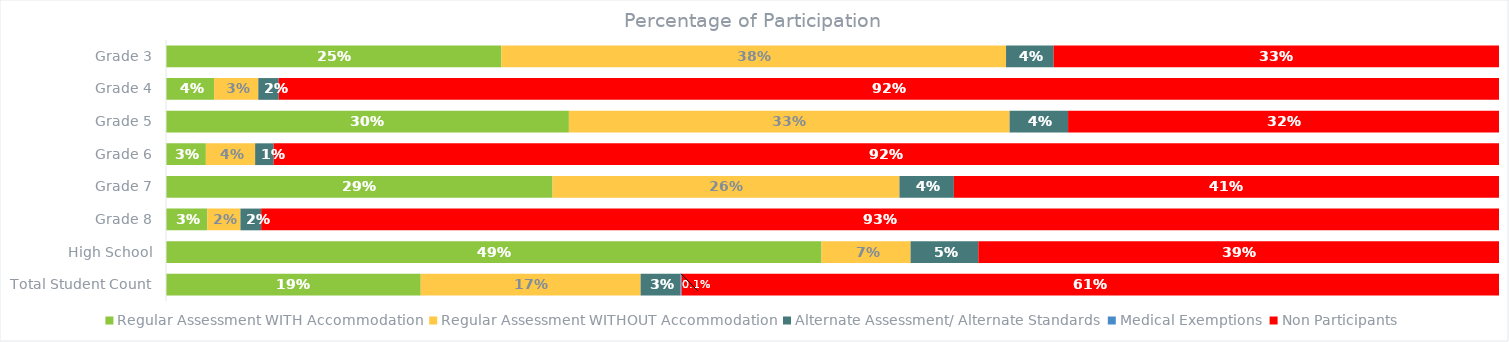
| Category | Regular Assessment WITH Accommodation | Regular Assessment WITHOUT Accommodation | Alternate Assessment/ Alternate Standards | Medical Exemptions | Non Participants |
|---|---|---|---|---|---|
| Grade 3 | 0.252 | 0.379 | 0.036 | 0 | 0.334 |
| Grade 4 | 0.036 | 0.033 | 0.015 | 0 | 0.915 |
| Grade 5 | 0.302 | 0.331 | 0.044 | 0 | 0.323 |
| Grade 6 | 0.03 | 0.037 | 0.014 | 0 | 0.919 |
| Grade 7 | 0.29 | 0.26 | 0.041 | 0 | 0.409 |
| Grade 8 | 0.031 | 0.025 | 0.016 | 0 | 0.929 |
| High School | 0.492 | 0.067 | 0.051 | 0 | 0.391 |
| Total Student Count | 0.191 | 0.165 | 0.03 | 0.001 | 0.614 |